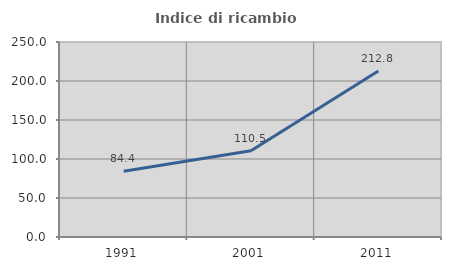
| Category | Indice di ricambio occupazionale  |
|---|---|
| 1991.0 | 84.351 |
| 2001.0 | 110.518 |
| 2011.0 | 212.793 |